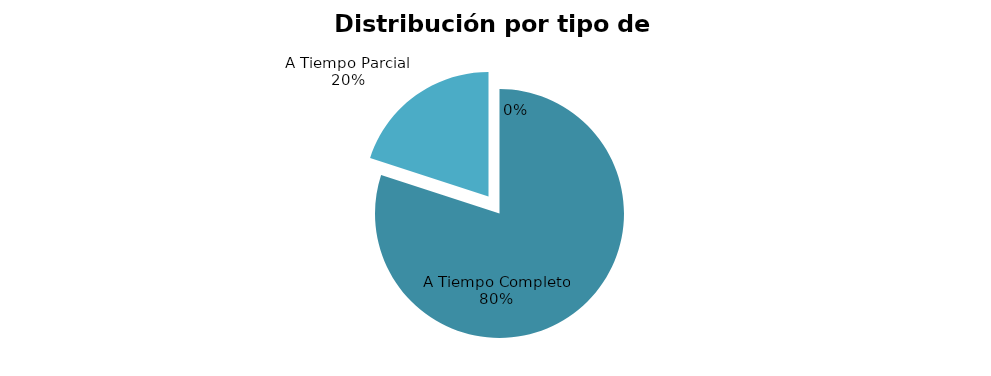
| Category | 4 |
|---|---|
| A Tiempo Completo | 4 |
| A Tiempo Parcial | 1 |